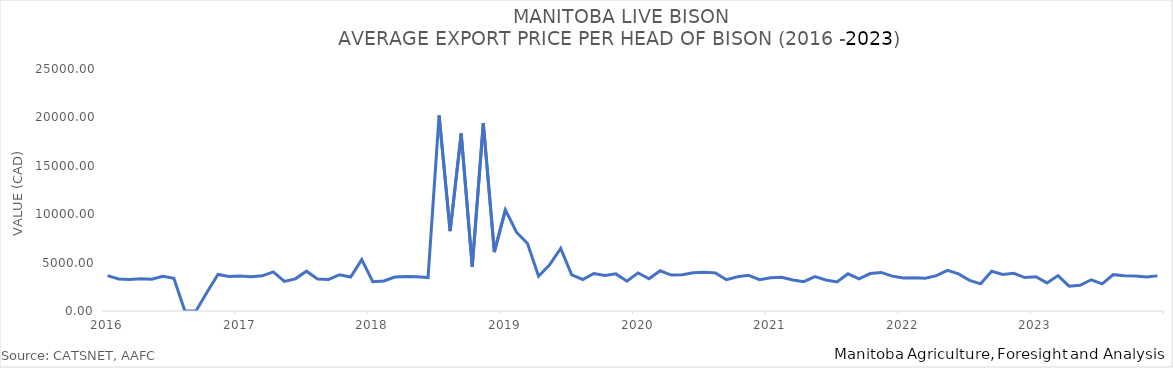
| Category | Total Bison P |
|---|---|
| 2016-01-01 | 3656.327 |
| 2016-02-01 | 3308.762 |
| 2016-03-01 | 3246.713 |
| 2016-04-01 | 3340.286 |
| 2016-05-01 | 3284.748 |
| 2016-06-01 | 3590.55 |
| 2016-07-01 | 3374.325 |
| 2016-08-01 | 0 |
| 2016-09-01 | 0 |
| 2016-10-01 | 1946.772 |
| 2016-11-01 | 3776.1 |
| 2016-12-01 | 3556.545 |
| 2017-01-01 | 3620.321 |
| 2017-02-01 | 3545.74 |
| 2017-03-01 | 3634.804 |
| 2017-04-01 | 4036.429 |
| 2017-05-01 | 3055.983 |
| 2017-06-01 | 3320.851 |
| 2017-07-01 | 4114.333 |
| 2017-08-01 | 3314.513 |
| 2017-09-01 | 3257.795 |
| 2017-10-01 | 3745.364 |
| 2017-11-01 | 3516.113 |
| 2017-12-01 | 5307.685 |
| 2018-01-01 | 3027.264 |
| 2018-02-01 | 3102.589 |
| 2018-03-01 | 3511.13 |
| 2018-04-01 | 3551.682 |
| 2018-05-01 | 3546.936 |
| 2018-06-01 | 3458.264 |
| 2018-07-01 | 20208.662 |
| 2018-08-01 | 8256.663 |
| 2018-09-01 | 18335.06 |
| 2018-10-01 | 4564.124 |
| 2018-11-01 | 19405.549 |
| 2018-12-01 | 6091.963 |
| 2019-01-01 | 10459.255 |
| 2019-02-01 | 8139.589 |
| 2019-03-01 | 6975.792 |
| 2019-04-01 | 3585.418 |
| 2019-05-01 | 4773.394 |
| 2019-06-01 | 6467.154 |
| 2019-07-01 | 3726.427 |
| 2019-08-01 | 3257.196 |
| 2019-09-01 | 3870.904 |
| 2019-10-01 | 3679.116 |
| 2019-11-01 | 3834.212 |
| 2019-12-01 | 3081.586 |
| 2020-01-01 | 3936.244 |
| 2020-02-01 | 3334.266 |
| 2020-03-01 | 4152.873 |
| 2020-04-01 | 3708.058 |
| 2020-05-01 | 3735.949 |
| 2020-06-01 | 3939.885 |
| 2020-07-01 | 4001.365 |
| 2020-08-01 | 3939.396 |
| 2020-09-01 | 3234.59 |
| 2020-10-01 | 3530.7 |
| 2020-11-01 | 3679.106 |
| 2020-12-01 | 3242.192 |
| 2021-01-01 | 3423.275 |
| 2021-02-01 | 3475.3 |
| 2021-03-01 | 3204.295 |
| 2021-04-01 | 3029.117 |
| 2021-05-01 | 3551.688 |
| 2021-06-01 | 3201.92 |
| 2021-07-01 | 2993.563 |
| 2021-08-01 | 3845.175 |
| 2021-09-01 | 3317.864 |
| 2021-10-01 | 3869.498 |
| 2021-11-01 | 3983.125 |
| 2021-12-01 | 3602.568 |
| 2022-01-01 | 3400.777 |
| 2022-02-01 | 3441.513 |
| 2022-03-01 | 3384.188 |
| 2022-04-01 | 3651.183 |
| 2022-05-01 | 4190.444 |
| 2022-06-01 | 3832.328 |
| 2022-07-01 | 3164.112 |
| 2022-08-01 | 2808.77 |
| 2022-09-01 | 4112.897 |
| 2022-10-01 | 3780.099 |
| 2022-11-01 | 3892.312 |
| 2022-12-01 | 3457.602 |
| 2023-01-01 | 3538.361 |
| 2023-02-01 | 2902.767 |
| 2023-03-01 | 3656.747 |
| 2023-04-01 | 2561.658 |
| 2023-05-01 | 2657.991 |
| 2023-06-01 | 3225.118 |
| 2023-07-01 | 2798.455 |
| 2023-08-01 | 3753.28 |
| 2023-09-01 | 3640.414 |
| 2023-10-01 | 3618.794 |
| 2023-11-01 | 3504.75 |
| 2023-12-01 | 3628.253 |